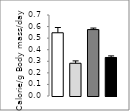
| Category | Series 0 |
|---|---|
| 0 | 0.546 |
| 1 | 0.283 |
| 2 | 0.574 |
| 3 | 0.333 |